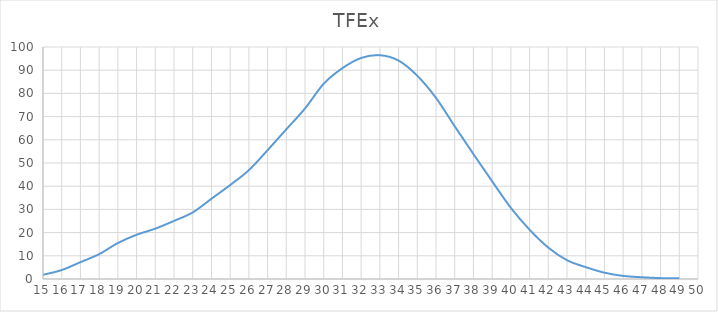
| Category | TFEx |
|---|---|
| 15.0 | 1.807 |
| 16.0 | 3.862 |
| 17.0 | 7.258 |
| 18.0 | 10.71 |
| 19.0 | 15.502 |
| 20.0 | 19.065 |
| 21.0 | 21.702 |
| 22.0 | 25.044 |
| 23.0 | 28.685 |
| 24.0 | 34.591 |
| 25.0 | 40.492 |
| 26.0 | 46.904 |
| 27.0 | 55.534 |
| 28.0 | 64.516 |
| 29.0 | 73.51 |
| 30.0 | 84.164 |
| 31.0 | 90.876 |
| 32.0 | 95.27 |
| 33.0 | 96.461 |
| 34.0 | 94.146 |
| 35.0 | 87.61 |
| 36.0 | 78.052 |
| 37.0 | 65.832 |
| 38.0 | 53.846 |
| 39.0 | 42.113 |
| 40.0 | 30.666 |
| 41.0 | 21.234 |
| 42.0 | 13.532 |
| 43.0 | 8.092 |
| 44.0 | 5.116 |
| 45.0 | 2.722 |
| 46.0 | 1.326 |
| 47.0 | 0.751 |
| 48.0 | 0.382 |
| 49.0 | 0.288 |